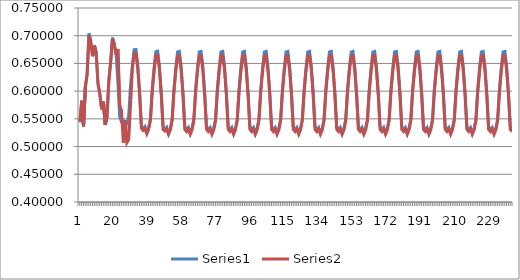
| Category | Series 0 | Series 1 |
|---|---|---|
| 0 | 0.544 | 0.545 |
| 1 | 0.583 | 0.582 |
| 2 | 0.536 | 0.536 |
| 3 | 0.609 | 0.606 |
| 4 | 0.632 | 0.63 |
| 5 | 0.704 | 0.7 |
| 6 | 0.691 | 0.688 |
| 7 | 0.663 | 0.663 |
| 8 | 0.683 | 0.682 |
| 9 | 0.669 | 0.668 |
| 10 | 0.614 | 0.613 |
| 11 | 0.596 | 0.594 |
| 12 | 0.569 | 0.567 |
| 13 | 0.581 | 0.58 |
| 14 | 0.54 | 0.539 |
| 15 | 0.555 | 0.554 |
| 16 | 0.62 | 0.618 |
| 17 | 0.654 | 0.651 |
| 18 | 0.696 | 0.694 |
| 19 | 0.685 | 0.683 |
| 20 | 0.669 | 0.665 |
| 21 | 0.617 | 0.676 |
| 22 | 0.554 | 0.575 |
| 23 | 0.545 | 0.565 |
| 24 | 0.547 | 0.507 |
| 25 | 0.534 | 0.547 |
| 26 | 0.541 | 0.507 |
| 27 | 0.556 | 0.513 |
| 28 | 0.61 | 0.575 |
| 29 | 0.646 | 0.64 |
| 30 | 0.675 | 0.668 |
| 31 | 0.675 | 0.668 |
| 32 | 0.647 | 0.64 |
| 33 | 0.599 | 0.595 |
| 34 | 0.538 | 0.533 |
| 35 | 0.532 | 0.529 |
| 36 | 0.536 | 0.532 |
| 37 | 0.525 | 0.523 |
| 38 | 0.534 | 0.531 |
| 39 | 0.55 | 0.548 |
| 40 | 0.604 | 0.599 |
| 41 | 0.642 | 0.635 |
| 42 | 0.671 | 0.664 |
| 43 | 0.672 | 0.665 |
| 44 | 0.644 | 0.638 |
| 45 | 0.597 | 0.593 |
| 46 | 0.537 | 0.531 |
| 47 | 0.531 | 0.528 |
| 48 | 0.535 | 0.531 |
| 49 | 0.524 | 0.522 |
| 50 | 0.533 | 0.53 |
| 51 | 0.549 | 0.547 |
| 52 | 0.604 | 0.598 |
| 53 | 0.641 | 0.635 |
| 54 | 0.671 | 0.663 |
| 55 | 0.672 | 0.664 |
| 56 | 0.644 | 0.637 |
| 57 | 0.597 | 0.593 |
| 58 | 0.536 | 0.531 |
| 59 | 0.53 | 0.527 |
| 60 | 0.535 | 0.531 |
| 61 | 0.524 | 0.522 |
| 62 | 0.533 | 0.53 |
| 63 | 0.549 | 0.547 |
| 64 | 0.604 | 0.598 |
| 65 | 0.641 | 0.635 |
| 66 | 0.671 | 0.663 |
| 67 | 0.672 | 0.664 |
| 68 | 0.644 | 0.637 |
| 69 | 0.596 | 0.593 |
| 70 | 0.536 | 0.531 |
| 71 | 0.53 | 0.527 |
| 72 | 0.535 | 0.531 |
| 73 | 0.524 | 0.522 |
| 74 | 0.533 | 0.53 |
| 75 | 0.549 | 0.547 |
| 76 | 0.604 | 0.598 |
| 77 | 0.641 | 0.635 |
| 78 | 0.671 | 0.663 |
| 79 | 0.672 | 0.664 |
| 80 | 0.644 | 0.637 |
| 81 | 0.596 | 0.593 |
| 82 | 0.536 | 0.531 |
| 83 | 0.53 | 0.527 |
| 84 | 0.535 | 0.531 |
| 85 | 0.524 | 0.522 |
| 86 | 0.533 | 0.53 |
| 87 | 0.549 | 0.547 |
| 88 | 0.604 | 0.598 |
| 89 | 0.641 | 0.635 |
| 90 | 0.671 | 0.663 |
| 91 | 0.672 | 0.664 |
| 92 | 0.644 | 0.637 |
| 93 | 0.596 | 0.593 |
| 94 | 0.536 | 0.531 |
| 95 | 0.53 | 0.527 |
| 96 | 0.535 | 0.531 |
| 97 | 0.524 | 0.522 |
| 98 | 0.533 | 0.53 |
| 99 | 0.549 | 0.547 |
| 100 | 0.604 | 0.598 |
| 101 | 0.641 | 0.635 |
| 102 | 0.671 | 0.663 |
| 103 | 0.672 | 0.664 |
| 104 | 0.644 | 0.637 |
| 105 | 0.596 | 0.593 |
| 106 | 0.536 | 0.531 |
| 107 | 0.53 | 0.527 |
| 108 | 0.535 | 0.531 |
| 109 | 0.524 | 0.522 |
| 110 | 0.533 | 0.53 |
| 111 | 0.549 | 0.547 |
| 112 | 0.604 | 0.598 |
| 113 | 0.641 | 0.635 |
| 114 | 0.671 | 0.663 |
| 115 | 0.672 | 0.664 |
| 116 | 0.644 | 0.637 |
| 117 | 0.596 | 0.593 |
| 118 | 0.536 | 0.531 |
| 119 | 0.53 | 0.527 |
| 120 | 0.535 | 0.531 |
| 121 | 0.524 | 0.522 |
| 122 | 0.533 | 0.53 |
| 123 | 0.549 | 0.547 |
| 124 | 0.604 | 0.598 |
| 125 | 0.641 | 0.635 |
| 126 | 0.671 | 0.663 |
| 127 | 0.672 | 0.664 |
| 128 | 0.644 | 0.637 |
| 129 | 0.596 | 0.593 |
| 130 | 0.536 | 0.531 |
| 131 | 0.53 | 0.527 |
| 132 | 0.535 | 0.531 |
| 133 | 0.524 | 0.522 |
| 134 | 0.533 | 0.53 |
| 135 | 0.549 | 0.547 |
| 136 | 0.604 | 0.598 |
| 137 | 0.641 | 0.635 |
| 138 | 0.671 | 0.663 |
| 139 | 0.672 | 0.664 |
| 140 | 0.644 | 0.637 |
| 141 | 0.596 | 0.593 |
| 142 | 0.536 | 0.531 |
| 143 | 0.53 | 0.527 |
| 144 | 0.535 | 0.531 |
| 145 | 0.524 | 0.522 |
| 146 | 0.533 | 0.53 |
| 147 | 0.549 | 0.547 |
| 148 | 0.604 | 0.598 |
| 149 | 0.641 | 0.635 |
| 150 | 0.671 | 0.663 |
| 151 | 0.672 | 0.664 |
| 152 | 0.644 | 0.637 |
| 153 | 0.596 | 0.593 |
| 154 | 0.536 | 0.531 |
| 155 | 0.53 | 0.527 |
| 156 | 0.535 | 0.531 |
| 157 | 0.524 | 0.522 |
| 158 | 0.533 | 0.53 |
| 159 | 0.549 | 0.547 |
| 160 | 0.604 | 0.598 |
| 161 | 0.641 | 0.635 |
| 162 | 0.671 | 0.663 |
| 163 | 0.672 | 0.664 |
| 164 | 0.644 | 0.637 |
| 165 | 0.596 | 0.593 |
| 166 | 0.536 | 0.531 |
| 167 | 0.53 | 0.527 |
| 168 | 0.535 | 0.531 |
| 169 | 0.524 | 0.522 |
| 170 | 0.533 | 0.53 |
| 171 | 0.549 | 0.547 |
| 172 | 0.604 | 0.598 |
| 173 | 0.641 | 0.635 |
| 174 | 0.671 | 0.663 |
| 175 | 0.672 | 0.664 |
| 176 | 0.644 | 0.637 |
| 177 | 0.596 | 0.593 |
| 178 | 0.536 | 0.531 |
| 179 | 0.53 | 0.527 |
| 180 | 0.535 | 0.531 |
| 181 | 0.524 | 0.522 |
| 182 | 0.533 | 0.53 |
| 183 | 0.549 | 0.547 |
| 184 | 0.604 | 0.598 |
| 185 | 0.641 | 0.635 |
| 186 | 0.671 | 0.663 |
| 187 | 0.672 | 0.664 |
| 188 | 0.644 | 0.637 |
| 189 | 0.596 | 0.593 |
| 190 | 0.536 | 0.531 |
| 191 | 0.53 | 0.527 |
| 192 | 0.535 | 0.531 |
| 193 | 0.524 | 0.522 |
| 194 | 0.533 | 0.53 |
| 195 | 0.549 | 0.547 |
| 196 | 0.604 | 0.598 |
| 197 | 0.641 | 0.635 |
| 198 | 0.671 | 0.663 |
| 199 | 0.672 | 0.664 |
| 200 | 0.644 | 0.637 |
| 201 | 0.596 | 0.593 |
| 202 | 0.536 | 0.531 |
| 203 | 0.53 | 0.527 |
| 204 | 0.535 | 0.531 |
| 205 | 0.524 | 0.522 |
| 206 | 0.533 | 0.53 |
| 207 | 0.549 | 0.547 |
| 208 | 0.604 | 0.598 |
| 209 | 0.641 | 0.635 |
| 210 | 0.671 | 0.663 |
| 211 | 0.672 | 0.664 |
| 212 | 0.644 | 0.637 |
| 213 | 0.596 | 0.593 |
| 214 | 0.536 | 0.531 |
| 215 | 0.53 | 0.527 |
| 216 | 0.535 | 0.531 |
| 217 | 0.524 | 0.522 |
| 218 | 0.533 | 0.53 |
| 219 | 0.549 | 0.547 |
| 220 | 0.604 | 0.598 |
| 221 | 0.641 | 0.635 |
| 222 | 0.671 | 0.663 |
| 223 | 0.672 | 0.664 |
| 224 | 0.644 | 0.637 |
| 225 | 0.596 | 0.593 |
| 226 | 0.536 | 0.531 |
| 227 | 0.53 | 0.527 |
| 228 | 0.535 | 0.531 |
| 229 | 0.524 | 0.522 |
| 230 | 0.533 | 0.53 |
| 231 | 0.549 | 0.547 |
| 232 | 0.604 | 0.598 |
| 233 | 0.641 | 0.635 |
| 234 | 0.671 | 0.663 |
| 235 | 0.672 | 0.664 |
| 236 | 0.644 | 0.637 |
| 237 | 0.596 | 0.593 |
| 238 | 0.536 | 0.531 |
| 239 | 0.53 | 0.527 |